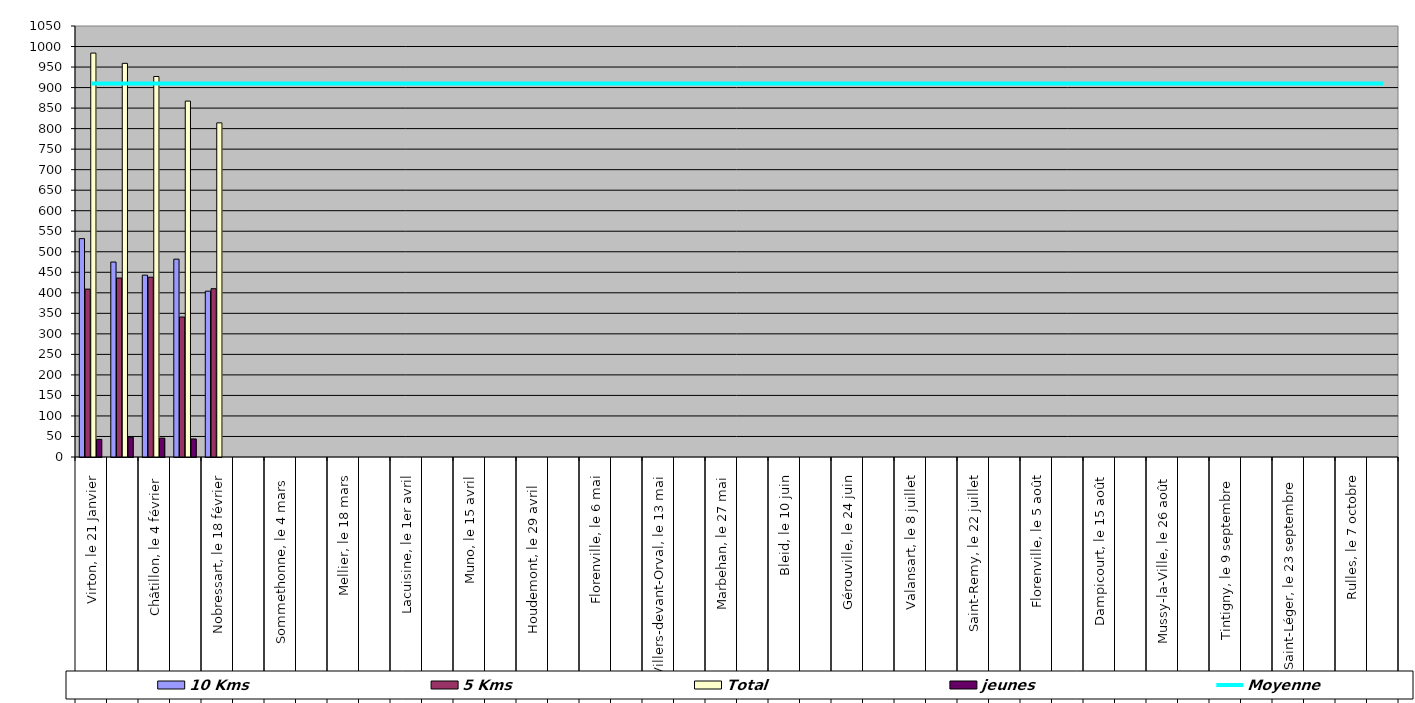
| Category | 10 Kms | 5 Kms | Total | jeunes |
|---|---|---|---|---|
| 0 | 532 | 409 | 984 | 43 |
| 1 | 475 | 436 | 959 | 48 |
| 2 | 443 | 438 | 927 | 46 |
| 3 | 482 | 341 | 867 | 44 |
| 4 | 404 | 410 | 814 | 0 |
| 5 | 0 | 0 | 0 | 0 |
| 6 | 0 | 0 | 0 | 0 |
| 7 | 0 | 0 | 0 | 0 |
| 8 | 0 | 0 | 0 | 0 |
| 9 | 0 | 0 | 0 | 0 |
| 10 | 0 | 0 | 0 | 0 |
| 11 | 0 | 0 | 0 | 0 |
| 12 | 0 | 0 | 0 | 0 |
| 13 | 0 | 0 | 0 | 0 |
| 14 | 0 | 0 | 0 | 0 |
| 15 | 0 | 0 | 0 | 0 |
| 16 | 0 | 0 | 0 | 0 |
| 17 | 0 | 0 | 0 | 0 |
| 18 | 0 | 0 | 0 | 0 |
| 19 | 0 | 0 | 0 | 0 |
| 20 | 0 | 0 | 0 | 0 |
| 21 | 0 | 0 | 0 | 0 |
| 22 | 0 | 0 | 0 | 0 |
| 23 | 0 | 0 | 0 | 0 |
| 24 | 0 | 0 | 0 | 0 |
| 25 | 0 | 0 | 0 | 0 |
| 26 | 0 | 0 | 0 | 0 |
| 27 | 0 | 0 | 0 | 0 |
| 28 | 0 | 0 | 0 | 0 |
| 29 | 0 | 0 | 0 | 0 |
| 30 | 0 | 0 | 0 | 0 |
| 31 | 0 | 0 | 0 | 0 |
| 32 | 0 | 0 | 0 | 0 |
| 33 | 0 | 0 | 0 | 0 |
| 34 | 0 | 0 | 0 | 0 |
| 35 | 0 | 0 | 0 | 0 |
| 36 | 0 | 0 | 0 | 0 |
| 37 | 0 | 0 | 0 | 0 |
| 38 | 0 | 0 | 0 | 0 |
| 39 | 0 | 0 | 0 | 0 |
| 40 | 0 | 0 | 0 | 0 |
| 41 | 0 | 0 | 0 | 0 |